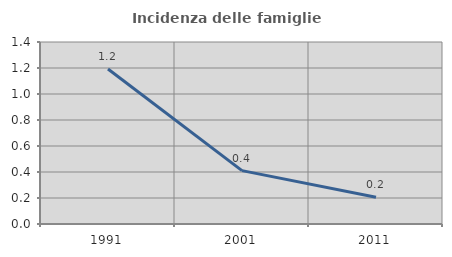
| Category | Incidenza delle famiglie numerose |
|---|---|
| 1991.0 | 1.193 |
| 2001.0 | 0.411 |
| 2011.0 | 0.206 |